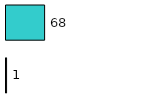
| Category | Series 0 | Series 1 |
|---|---|---|
| 0 | 1 | 68 |